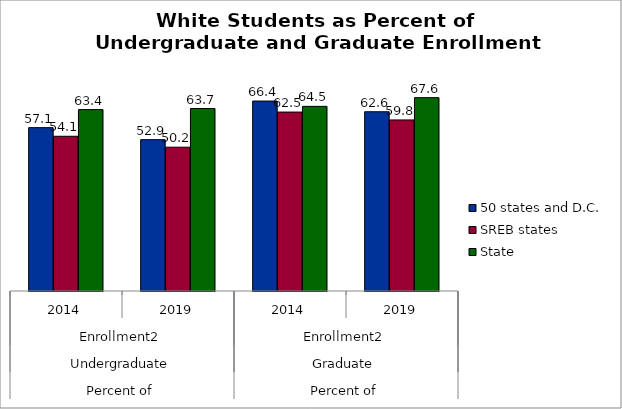
| Category | 50 states and D.C. | SREB states | State |
|---|---|---|---|
| 0 | 57.07 | 54.05 | 63.376 |
| 1 | 52.874 | 50.236 | 63.745 |
| 2 | 66.354 | 62.509 | 64.501 |
| 3 | 62.622 | 59.764 | 67.554 |